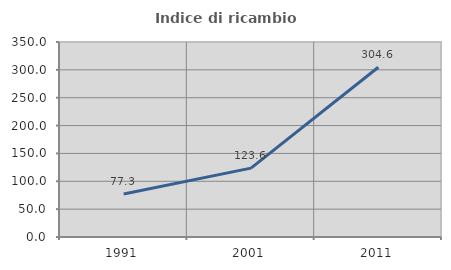
| Category | Indice di ricambio occupazionale  |
|---|---|
| 1991.0 | 77.301 |
| 2001.0 | 123.59 |
| 2011.0 | 304.622 |